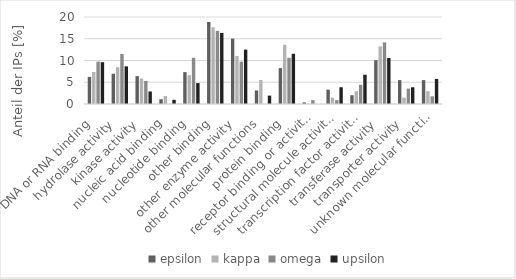
| Category | epsilon | kappa | omega | upsilon |
|---|---|---|---|---|
| DNA or RNA binding  | 6.227 | 7.353 | 9.735 | 9.615 |
| hydrolase activity  | 6.96 | 8.456 | 11.504 | 8.654 |
| kinase activity  | 6.41 | 5.882 | 5.31 | 2.885 |
| nucleic acid binding  | 1.099 | 1.838 | 0 | 0.962 |
| nucleotide binding  | 7.326 | 6.618 | 10.619 | 4.808 |
| other binding  | 18.864 | 17.647 | 16.814 | 16.346 |
| other enzyme activity  | 15.018 | 11.029 | 9.735 | 12.5 |
| other molecular functions  | 3.114 | 5.515 | 0 | 1.923 |
| protein binding  | 8.242 | 13.603 | 10.619 | 11.538 |
| receptor binding or activity  | 0.366 | 0 | 0.885 | 0 |
| structural molecule activity  | 3.297 | 1.471 | 0.885 | 3.846 |
| transcription factor activity  | 2.015 | 2.941 | 4.425 | 6.731 |
| transferase activity  | 10.073 | 13.235 | 14.159 | 10.577 |
| transporter activity  | 5.495 | 1.471 | 3.54 | 3.846 |
| unknown molecular functions  | 5.495 | 2.941 | 1.77 | 5.769 |